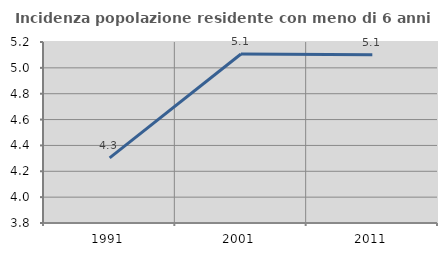
| Category | Incidenza popolazione residente con meno di 6 anni |
|---|---|
| 1991.0 | 4.303 |
| 2001.0 | 5.107 |
| 2011.0 | 5.101 |